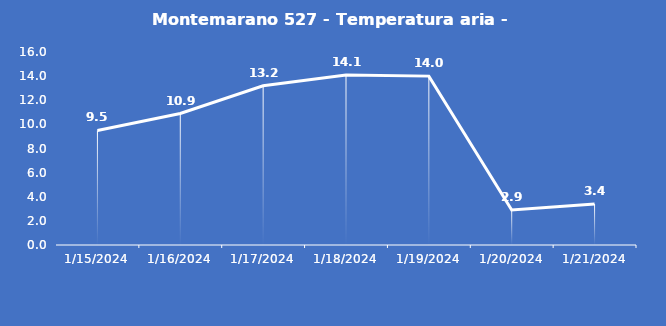
| Category | Montemarano 527 - Temperatura aria - Grezzo (°C) |
|---|---|
| 1/15/24 | 9.5 |
| 1/16/24 | 10.9 |
| 1/17/24 | 13.2 |
| 1/18/24 | 14.1 |
| 1/19/24 | 14 |
| 1/20/24 | 2.9 |
| 1/21/24 | 3.4 |